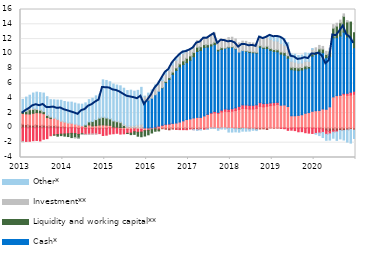
| Category | Transaction accounts | Housing | Consumer | Cash* | Liquidity and working capital** | Investment** | Other* |
|---|---|---|---|---|---|---|---|
| 2013-01-01 | 0.508 | 1.431 | -1.847 | 0 | 0.247 | -0.025 | 1.661 |
| 2013-02-01 | 0.453 | 1.445 | -1.828 | 0 | 0.347 | 0.059 | 1.858 |
| 2013-03-01 | 0.396 | 1.481 | -1.809 | 0 | 0.577 | 0.174 | 1.791 |
| 2013-04-01 | 0.363 | 1.611 | -1.729 | 0 | 0.524 | 0.158 | 2.057 |
| 2013-05-01 | 0.428 | 1.629 | -1.697 | 0 | 0.421 | 0.119 | 2.236 |
| 2013-06-01 | 0.354 | 1.679 | -1.76 | 0 | 0.356 | 0.073 | 2.298 |
| 2013-07-01 | 0.377 | 1.547 | -1.534 | 0 | 0.28 | 0.055 | 2.445 |
| 2013-08-01 | 0.277 | 1.122 | -1.451 | 0 | 0.273 | 0.107 | 2.436 |
| 2013-09-01 | 0.283 | 0.981 | -1.058 | 0 | 0.173 | 0.116 | 2.267 |
| 2013-10-01 | 0.296 | 0.993 | -0.949 | 0 | -0.033 | 0.081 | 2.425 |
| 2013-11-01 | 0.234 | 0.883 | -0.898 | 0 | -0.218 | 0.069 | 2.571 |
| 2013-12-01 | 0.178 | 0.692 | -0.843 | 0 | -0.202 | 0.115 | 2.751 |
| 2014-01-01 | 0.161 | 0.59 | -0.827 | 0 | -0.283 | 0.112 | 2.704 |
| 2014-02-01 | 0.047 | 0.58 | -0.791 | 0 | -0.379 | 0.1 | 2.763 |
| 2014-03-01 | 0.093 | 0.545 | -0.742 | 0 | -0.569 | 0.016 | 2.827 |
| 2014-04-01 | 0.086 | 0.425 | -0.769 | 0 | -0.554 | -0.011 | 2.841 |
| 2014-05-01 | -0.103 | 0.39 | -0.777 | 0 | -0.503 | -0.016 | 2.846 |
| 2014-06-01 | 0.02 | 0.27 | -0.77 | 0 | -0.102 | -0.004 | 2.917 |
| 2014-07-01 | -0.1 | 0.167 | -0.769 | 0 | 0.237 | -0.031 | 2.979 |
| 2014-08-01 | -0.098 | 0.395 | -0.748 | 0 | 0.414 | -0.032 | 3.01 |
| 2014-09-01 | -0.081 | 0.267 | -0.729 | 0 | 0.594 | -0.055 | 3.145 |
| 2014-10-01 | -0.149 | 0.302 | -0.669 | 0 | 0.817 | -0.022 | 3.213 |
| 2014-11-01 | -0.14 | 0.382 | -0.636 | 0 | 0.945 | 0.036 | 3.176 |
| 2014-12-01 | -0.096 | 0.404 | -0.93 | 0 | 1.047 | 0.02 | 5.023 |
| 2015-01-01 | -0.103 | 0.371 | -0.88 | 0 | 0.971 | 0.029 | 5.041 |
| 2015-02-01 | 0.049 | 0.294 | -0.837 | 0 | 0.885 | 0.01 | 4.996 |
| 2015-03-01 | 0.079 | 0.039 | -0.79 | 0 | 0.818 | 0.043 | 4.945 |
| 2015-04-01 | 0.097 | -0.029 | -0.7 | 0 | 0.733 | 0.112 | 4.846 |
| 2015-05-01 | 0.037 | -0.211 | -0.623 | 0 | 0.663 | 0.156 | 4.828 |
| 2015-06-01 | 0.048 | -0.237 | -0.564 | 0 | 0.273 | 0.217 | 4.827 |
| 2015-07-01 | 0.011 | -0.222 | -0.512 | 0 | -0.03 | 0.258 | 4.777 |
| 2015-08-01 | 0.06 | -0.235 | -0.472 | 0 | -0.202 | 0.254 | 4.784 |
| 2015-09-01 | -0.027 | -0.077 | -0.415 | 0 | -0.356 | 0.321 | 4.643 |
| 2015-10-01 | -0.034 | -0.17 | -0.385 | 0 | -0.533 | 0.409 | 4.662 |
| 2015-11-01 | 0.008 | -0.216 | -0.356 | 0 | -0.624 | 0.491 | 4.982 |
| 2015-12-01 | -0.089 | -0.265 | -0.024 | 3.632 | -0.722 | 0.632 | 0.016 |
| 2016-01-01 | -0.127 | -0.175 | -0.021 | 3.762 | -0.611 | 0.682 | 0.257 |
| 2016-02-01 | -0.043 | -0.189 | 0.001 | 4.013 | -0.457 | 0.748 | 0.372 |
| 2016-03-01 | -0.152 | 0.065 | 0.042 | 4.376 | -0.299 | 0.899 | 0.433 |
| 2016-04-01 | -0.291 | 0.194 | 0.05 | 4.714 | -0.12 | 0.918 | 0.433 |
| 2016-05-01 | -0.108 | 0.303 | 0.059 | 5.046 | 0.031 | 0.954 | 0.425 |
| 2016-06-01 | -0.176 | 0.432 | 0.056 | 5.656 | 0.139 | 0.962 | 0.437 |
| 2016-07-01 | -0.255 | 0.503 | 0.03 | 6.024 | 0.239 | 0.947 | 0.404 |
| 2016-08-01 | -0.154 | 0.606 | 0.004 | 6.623 | 0.307 | 0.957 | 0.426 |
| 2016-09-01 | -0.178 | 0.661 | -0.02 | 7.102 | 0.348 | 1.031 | 0.396 |
| 2016-10-01 | -0.176 | 0.793 | -0.055 | 7.461 | 0.394 | 1.006 | 0.414 |
| 2016-11-01 | -0.174 | 0.952 | -0.065 | 7.609 | 0.499 | 0.969 | 0.433 |
| 2016-12-01 | -0.201 | 1.131 | -0.045 | 7.685 | 0.596 | 0.886 | 0.263 |
| 2017-01-01 | -0.106 | 1.22 | -0.024 | 7.92 | 0.595 | 0.87 | 0.053 |
| 2017-02-01 | -0.207 | 1.343 | -0.03 | 8.279 | 0.584 | 0.861 | -0.029 |
| 2017-03-01 | -0.208 | 1.424 | -0.041 | 8.897 | 0.588 | 0.894 | -0.087 |
| 2017-04-01 | -0.152 | 1.419 | -0.038 | 9.037 | 0.509 | 0.925 | -0.101 |
| 2017-05-01 | -0.139 | 1.617 | -0.009 | 9.239 | 0.4 | 0.979 | 0.036 |
| 2017-06-01 | -0.149 | 1.807 | 0.026 | 9.09 | 0.33 | 1.082 | -0.071 |
| 2017-07-01 | -0.013 | 1.938 | 0.095 | 9.039 | 0.286 | 1.153 | -0.047 |
| 2017-08-01 | -0.026 | 2.037 | 0.187 | 9.028 | 0.319 | 1.239 | -0.048 |
| 2017-09-01 | -0.096 | 1.953 | 0.144 | 8.311 | 0.208 | 1.123 | -0.228 |
| 2017-10-01 | -0.014 | 2.157 | 0.238 | 8.209 | 0.241 | 1.163 | -0.142 |
| 2017-11-01 | -0.023 | 2.254 | 0.303 | 8.195 | 0.045 | 1.16 | -0.142 |
| 2017-12-01 | -0.056 | 2.205 | 0.311 | 8.33 | 0.09 | 1.26 | -0.508 |
| 2018-01-01 | -0.081 | 2.265 | 0.327 | 8.3 | 0.083 | 1.278 | -0.481 |
| 2018-02-01 | -0.113 | 2.34 | 0.369 | 7.965 | 0.047 | 1.301 | -0.424 |
| 2018-03-01 | -0.111 | 2.495 | 0.416 | 7.335 | -0.033 | 1.25 | -0.433 |
| 2018-04-01 | -0.081 | 2.649 | 0.463 | 7.33 | -0.002 | 1.282 | -0.359 |
| 2018-05-01 | -0.115 | 2.601 | 0.491 | 7.248 | 0.078 | 1.279 | -0.329 |
| 2018-06-01 | -0.166 | 2.547 | 0.505 | 7.138 | 0.143 | 1.197 | -0.261 |
| 2018-07-01 | -0.145 | 2.554 | 0.495 | 7.101 | 0.124 | 1.2 | -0.178 |
| 2018-08-01 | -0.225 | 2.647 | 0.474 | 6.992 | 0.092 | 1.178 | -0.137 |
| 2018-09-01 | -0.14 | 2.915 | 0.498 | 7.489 | 0.205 | 1.226 | 0.07 |
| 2018-10-01 | -0.125 | 2.846 | 0.442 | 7.456 | 0.158 | 1.193 | 0.104 |
| 2018-11-01 | -0.206 | 2.929 | 0.385 | 7.416 | 0.306 | 1.244 | 0.165 |
| 2018-12-01 | -0.005 | 3.009 | 0.366 | 7.096 | 0.257 | 1.224 | 0.559 |
| 2019-01-01 | -0.045 | 3.078 | 0.343 | 6.898 | 0.267 | 1.186 | 0.594 |
| 2019-02-01 | -0.024 | 3.175 | 0.284 | 6.823 | 0.273 | 1.178 | 0.658 |
| 2019-03-01 | -0.041 | 3.067 | -0.017 | 6.909 | 0.281 | 1.148 | 0.909 |
| 2019-04-01 | -0.041 | 3.102 | -0.071 | 6.728 | 0.35 | 0.959 | 0.944 |
| 2019-05-01 | -0.101 | 2.892 | -0.229 | 6.532 | 0.332 | 0.851 | 0.917 |
| 2019-06-01 | -0.032 | 1.641 | -0.277 | 6.225 | 0.324 | 0.815 | 0.995 |
| 2019-07-01 | -0.025 | 1.64 | -0.34 | 6.167 | 0.367 | 0.718 | 1.061 |
| 2019-08-01 | -0.025 | 1.693 | -0.499 | 6.043 | 0.38 | 0.64 | 1.02 |
| 2019-09-01 | 0.002 | 1.775 | -0.51 | 6.049 | 0.332 | 0.612 | 1.07 |
| 2019-10-01 | -0.05 | 1.982 | -0.601 | 6.001 | 0.376 | 0.64 | 1.135 |
| 2019-11-01 | 0.007 | 2.063 | -0.707 | 6.01 | 0.22 | 0.687 | 1.09 |
| 2019-12-01 | -0.045 | 2.247 | -0.705 | 7.459 | 0.31 | 0.604 | 0.109 |
| 2020-01-31 | -0.067 | 2.32 | -0.682 | 7.598 | 0.358 | 0.543 | -0.107 |
| 2020-02-29 | -0.05 | 2.357 | -0.646 | 7.878 | 0.431 | 0.481 | -0.343 |
| 2020-03-31 | -0.142 | 2.559 | -0.469 | 7.592 | 0.497 | 0.362 | -0.693 |
| 2020-04-30 | -0.391 | 2.519 | -0.482 | 6.976 | 0.428 | 0.428 | -0.807 |
| 2020-05-31 | -0.497 | 2.845 | -0.315 | 6.823 | 0.636 | 0.451 | -0.835 |
| 2020-06-30 | -0.368 | 4.188 | -0.212 | 7.993 | 1.298 | 0.472 | -0.814 |
| 2020-07-31 | -0.412 | 4.363 | -0.136 | 7.827 | 1.569 | 0.389 | -1.144 |
| 2020-08-31 | -0.35 | 4.374 | 0.053 | 7.995 | 1.779 | 0.365 | -1.139 |
| 2020-09-30 | -0.363 | 4.491 | 0.175 | 8.283 | 2.132 | 0.326 | -1.274 |
| 2020-10-31 | -0.292 | 4.411 | 0.268 | 7.607 | 2.03 | 0.189 | -1.627 |
| 2020-11-30 | -0.235 | 4.434 | 0.387 | 7.362 | 2.118 | -0.01 | -1.811 |
| 2020-12-31 | -0.3 | 4.547 | 0.414 | 5.86 | 2.023 | -0.042 | -1.076 |